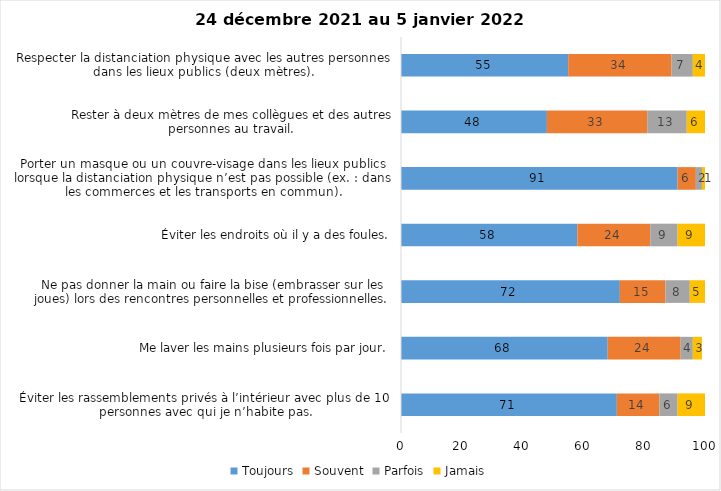
| Category | Toujours | Souvent | Parfois | Jamais |
|---|---|---|---|---|
| Éviter les rassemblements privés à l’intérieur avec plus de 10 personnes avec qui je n’habite pas. | 71 | 14 | 6 | 9 |
| Me laver les mains plusieurs fois par jour. | 68 | 24 | 4 | 3 |
| Ne pas donner la main ou faire la bise (embrasser sur les joues) lors des rencontres personnelles et professionnelles. | 72 | 15 | 8 | 5 |
| Éviter les endroits où il y a des foules. | 58 | 24 | 9 | 9 |
| Porter un masque ou un couvre-visage dans les lieux publics lorsque la distanciation physique n’est pas possible (ex. : dans les commerces et les transports en commun). | 91 | 6 | 2 | 1 |
| Rester à deux mètres de mes collègues et des autres personnes au travail. | 48 | 33 | 13 | 6 |
| Respecter la distanciation physique avec les autres personnes dans les lieux publics (deux mètres). | 55 | 34 | 7 | 4 |